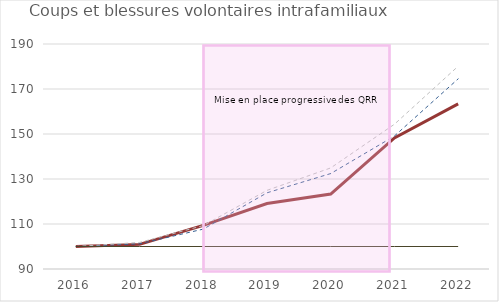
| Category | QRR | Unités urbaines englobantes | Unités urbaines de plus de 10 000 hab. | Series 0 |
|---|---|---|---|---|
| 2016.0 | 100 | 100 | 100 | 100 |
| 2017.0 | 100.943 | 101.178 | 101.817 | 100 |
| 2018.0 | 109.401 | 107.731 | 109.3 | 100 |
| 2019.0 | 119.083 | 123.866 | 124.955 | 100 |
| 2020.0 | 123.287 | 132.418 | 134.917 | 100 |
| 2021.0 | 148.255 | 149.098 | 154.339 | 100 |
| 2022.0 | 163.363 | 174.505 | 180.121 | 100 |